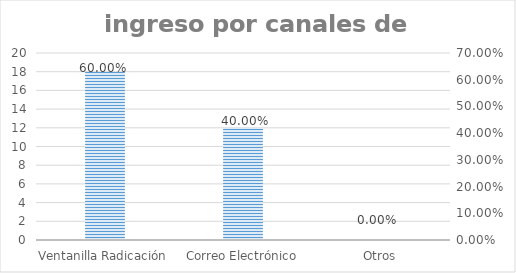
| Category | Series 0 |
|---|---|
| Ventanilla Radicación | 18 |
| Correo Electrónico | 12 |
| Otros | 0 |